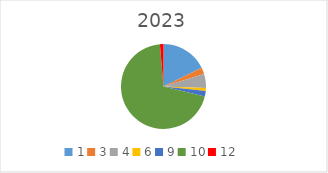
| Category | Series 0 |
|---|---|
| 1.0 | 66000 |
| 3.0 | 9250 |
| 4.0 | 20000 |
| 6.0 | 4000 |
| 9.0 | 8000 |
| 10.0 | 260000 |
| 12.0 | 5000 |